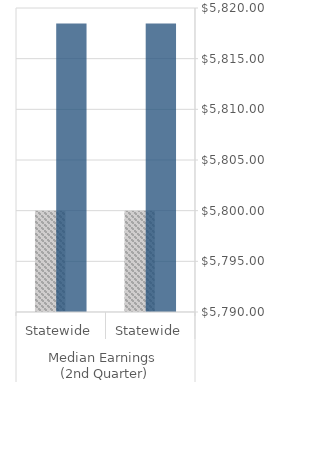
| Category | Negotiated | Actual |
|---|---|---|
| 0 | 5800 | 5818.465 |
| 1 | 5800 | 5818.465 |